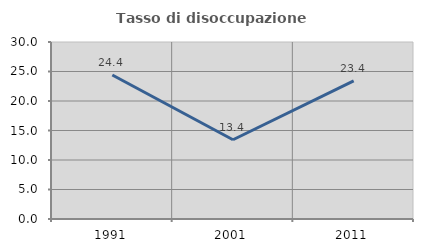
| Category | Tasso di disoccupazione giovanile  |
|---|---|
| 1991.0 | 24.409 |
| 2001.0 | 13.433 |
| 2011.0 | 23.404 |